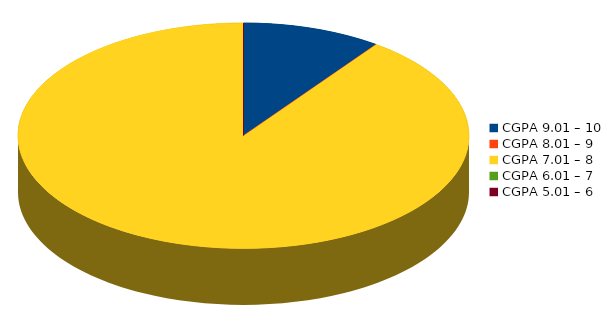
| Category | Number of students |
|---|---|
| CGPA 9.01 – 10 | 1 |
| CGPA 8.01 – 9 | 0 |
| CGPA 7.01 – 8 | 9 |
| CGPA 6.01 – 7 | 0 |
| CGPA 5.01 – 6 | 0 |